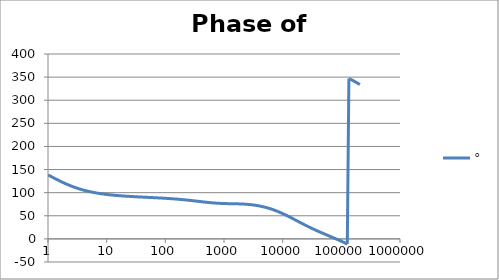
| Category | ° |
|---|---|
| 1.0 | 138.399 |
| 1.0634378492473788 | 136.643 |
| 1.1309000592118907 | 134.88 |
| 1.2026419266820265 | 133.117 |
| 1.278934943925458 | 131.361 |
| 1.3600678260954062 | 129.618 |
| 1.4463476038134566 | 127.895 |
| 1.5381007850634825 | 126.197 |
| 1.6356745907936145 | 124.531 |
| 1.739438268902148 | 122.9 |
| 1.849784491579884 | 121.309 |
| 1.967130841296868 | 119.762 |
| 2.091921391056928 | 118.262 |
| 2.2246283849001642 | 116.812 |
| 2.365754025012901 | 115.413 |
| 2.5158323722080485 | 114.066 |
| 2.6754313669678584 | 112.774 |
| 2.8451549786972743 | 111.535 |
| 3.025645491321301 | 110.35 |
| 3.2175859338757533 | 109.218 |
| 3.42170266528945 | 108.138 |
| 3.6387681231394358 | 107.11 |
| 3.8696037467813236 | 106.132 |
| 4.115083085916729 | 105.203 |
| 4.376135106361553 | 104.321 |
| 4.653747705525078 | 103.484 |
| 4.948971450903514 | 102.691 |
| 5.262923555735513 | 101.94 |
| 5.596792106864742 | 101.228 |
| 5.951840560808945 | 100.555 |
| 6.329412525049976 | 99.918 |
| 6.730936842638569 | 99.315 |
| 7.157932999355504 | 98.745 |
| 7.612016873891456 | 98.206 |
| 8.094906852805886 | 97.696 |
| 8.608430333405762 | 97.213 |
| 9.154530639152917 | 96.757 |
| 9.735274373770007 | 96.326 |
| 10.352859241875105 | 95.917 |
| 11.009622365740512 | 95.53 |
| 11.708049129648925 | 95.163 |
| 12.4507825853165 | 94.815 |
| 13.240633453975693 | 94.486 |
| 14.080590762968805 | 94.172 |
| 14.973833157104059 | 93.875 |
| 15.923740927579823 | 93.591 |
| 16.93390880399795 | 93.321 |
| 18.008159557874837 | 93.064 |
| 19.150558469130036 | 92.818 |
| 20.365428710297824 | 92.582 |
| 21.65736770667993 | 92.356 |
| 23.031264534351347 | 92.139 |
| 24.492318421858034 | 91.93 |
| 26.046058425622668 | 91.729 |
| 27.698364353515743 | 91.534 |
| 29.45548901577305 | 91.344 |
| 31.32408188746347 | 91.16 |
| 33.311214272052936 | 90.98 |
| 35.42440606129053 | 90.804 |
| 37.67165419268462 | 90.631 |
| 40.06146291225952 | 90.46 |
| 42.60287595711691 | 90.291 |
| 45.30551077958928 | 90.124 |
| 48.17959494250036 | 89.957 |
| 51.23600482326248 | 89.79 |
| 54.486306773278585 | 89.622 |
| 57.94280088840825 | 89.453 |
| 61.61856755613799 | 89.282 |
| 65.52751695560372 | 89.109 |
| 69.68444169778837 | 88.932 |
| 74.10507280510043 | 88.752 |
| 78.80613924217637 | 88.568 |
| 83.8054312231895 | 88.379 |
| 89.12186753523771 | 88.185 |
| 94.77556713258299 | 87.984 |
| 100.78792527267464 | 87.777 |
| 107.18169448207877 | 87.562 |
| 113.98107065871142 | 87.34 |
| 121.21178463621371 | 87.109 |
| 128.90119955697148 | 86.87 |
| 137.07841442227294 | 86.621 |
| 145.77437421146283 | 86.362 |
| 155.02198698682062 | 86.093 |
| 164.85624842731968 | 85.812 |
| 175.3143742625403 | 85.521 |
| 186.43594110790573 | 85.219 |
| 198.26303623420247 | 84.905 |
| 210.84041683815525 | 84.579 |
| 224.21567941678887 | 84.242 |
| 238.43943988652958 | 83.894 |
| 253.56552512868072 | 83.536 |
| 269.65117668612646 | 83.167 |
| 286.75726738211927 | 82.79 |
| 304.9485316808965 | 82.405 |
| 324.2938106618788 | 82.013 |
| 344.8663125345048 | 81.617 |
| 366.7438896795682 | 81.218 |
| 390.00933326545766 | 80.819 |
| 414.7506865542229 | 80.422 |
| 441.06157808309626 | 80.03 |
| 469.0415759823428 | 79.645 |
| 498.7965647702637 | 79.271 |
| 530.4391460512702 | 78.911 |
| 564.089064633379 | 78.567 |
| 599.8736616776864 | 78.242 |
| 637.9283565946681 | 77.939 |
| 678.3971595109495 | 77.66 |
| 721.4332162458546 | 77.406 |
| 767.1993878601115 | 77.177 |
| 815.868866969862 | 76.975 |
| 867.6258331583267 | 76.799 |
| 922.6661499653554 | 76.648 |
| 981.1981060925172 | 76.519 |
| 1043.443203628628 | 76.41 |
| 1109.6369962786232 | 76.319 |
| 1180.0299807678607 | 76.241 |
| 1254.8885447951977 | 76.173 |
| 1334.4959751221782 | 76.11 |
| 1419.1535296132129 | 76.048 |
| 1509.1815772837017 | 75.982 |
| 1604.9208106703452 | 75.908 |
| 1706.7335351116335 | 75.821 |
| 1815.0050398174897 | 75.717 |
| 1930.1450559166665 | 75.591 |
| 2052.58930699948 | 75.44 |
| 2182.801158023697 | 75.26 |
| 2321.2733688234066 | 75.047 |
| 2468.5299588567814 | 74.798 |
| 2625.128190249376 | 74.511 |
| 2791.6606766374607 | 74.181 |
| 2968.757625791824 | 73.806 |
| 3157.08922450881 | 73.385 |
| 3357.3681747937244 | 72.914 |
| 3570.352390934236 | 72.391 |
| 3796.8478676703417 | 71.814 |
| 4037.7117303148448 | 71.182 |
| 4293.8554783669315 | 70.492 |
| 4566.248434893605 | 69.743 |
| 4855.9214147324665 | 68.933 |
| 5163.970625397384 | 68.062 |
| 5491.561815449236 | 67.127 |
| 5839.934686030357 | 66.129 |
| 6210.40758225729 | 65.067 |
| 6604.382482225307 | 63.94 |
| 7023.350302504747 | 62.749 |
| 7468.896540206577 | 61.494 |
| 7942.707272968458 | 60.177 |
| 8446.575539567106 | 58.799 |
| 8982.408125302747 | 57.363 |
| 9552.232777834151 | 55.871 |
| 10158.205880770249 | 54.326 |
| 10802.620614058389 | 52.732 |
| 11487.915632049675 | 51.094 |
| 12216.684292082227 | 49.417 |
| 12991.684468506162 | 47.706 |
| 13815.848989288772 | 45.967 |
| 14692.296734695852 | 44.206 |
| 15624.344440049217 | 42.429 |
| 16615.519247226184 | 40.642 |
| 17669.572052398642 | 38.851 |
| 18790.49170052441 | 37.062 |
| 19982.5200803064 | 35.281 |
| 21250.168176743602 | 33.511 |
| 22598.233142021272 | 31.759 |
| 24031.816449341983 | 30.026 |
| 25556.34319839602 | 28.317 |
| 27177.582645530147 | 26.633 |
| 28901.67003630542 | 24.976 |
| 30735.129823066054 | 23.347 |
| 32684.900355380338 | 21.745 |
| 34758.3601367905 | 20.171 |
| 36963.35574723439 | 18.622 |
| 39308.23153680468 | 17.098 |
| 41801.861203217486 | 15.595 |
| 44453.68137248706 | 14.112 |
| 47273.727309885995 | 12.646 |
| 50272.670896332245 | 11.194 |
| 53461.86101391677 | 9.752 |
| 56853.36649340195 | 8.318 |
| 60460.02178621637 | 6.888 |
| 64295.47553378361 | 5.458 |
| 68374.24221798431 | 4.027 |
| 72711.75708821259 | 2.589 |
| 77324.43457288652 | 1.142 |
| 82229.73039646025 | -0.317 |
| 87446.2076370035 | -1.792 |
| 92993.60697433475 | -3.287 |
| 98892.92139454243 | -4.805 |
| 105166.47563360249 | -6.349 |
| 111838.01066072512 | -7.923 |
| 118932.77352114675 | -9.531 |
| 126477.61287835392 | -11.176 |
| 134501.0806172993 | 347.138 |
| 143033.53989310883 | 345.407 |
| 152107.28003416685 | 343.627 |
| 161756.63873440344 | 341.795 |
| 172018.1319971993 | 339.908 |
| 182930.592322653 | 337.961 |
| 194535.31566115122 | 335.953 |
| 206876.217689355 | 333.879 |